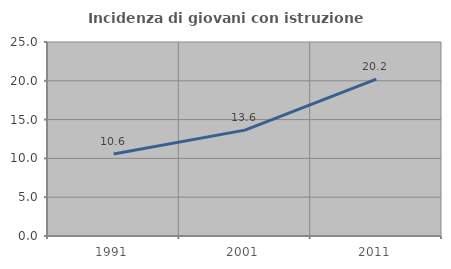
| Category | Incidenza di giovani con istruzione universitaria |
|---|---|
| 1991.0 | 10.563 |
| 2001.0 | 13.646 |
| 2011.0 | 20.227 |